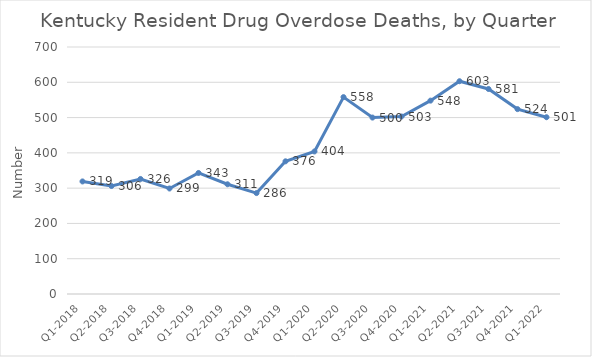
| Category | Series 0 |
|---|---|
| Q1-2018 | 319 |
| Q2-2018 | 306 |
| Q3-2018 | 326 |
| Q4-2018 | 299 |
| Q1-2019 | 343 |
| Q2-2019 | 311 |
| Q3-2019 | 286 |
| Q4-2019 | 376 |
| Q1-2020 | 404 |
| Q2-2020 | 558 |
| Q3-2020 | 500 |
| Q4-2020 | 503 |
| Q1-2021 | 548 |
| Q2-2021 | 603 |
| Q3-2021 | 581 |
| Q4-2021 | 524 |
| Q1-2022 | 501 |